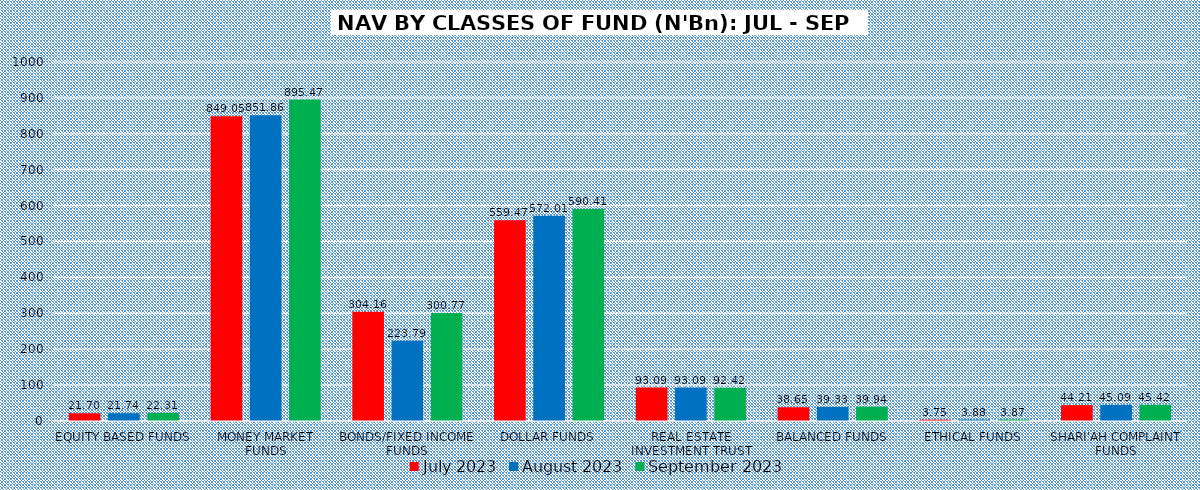
| Category | July 2023 | August 2023 | September 2023 |
|---|---|---|---|
| EQUITY BASED FUNDS | 21.704 | 21.744 | 22.305 |
| MONEY MARKET FUNDS | 849.053 | 851.855 | 895.47 |
| BONDS/FIXED INCOME FUNDS | 304.163 | 223.79 | 300.772 |
| DOLLAR FUNDS | 559.469 | 572.006 | 590.415 |
| REAL ESTATE INVESTMENT TRUST | 93.087 | 93.091 | 92.422 |
| BALANCED FUNDS | 38.647 | 39.334 | 39.942 |
| ETHICAL FUNDS | 3.748 | 3.884 | 3.869 |
| SHARI'AH COMPLAINT FUNDS | 44.207 | 45.095 | 45.423 |